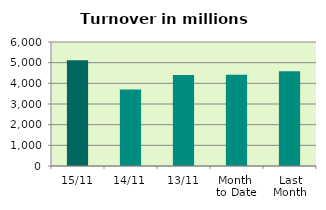
| Category | Series 0 |
|---|---|
| 15/11 | 5120.647 |
| 14/11 | 3697.249 |
| 13/11 | 4401.179 |
| Month 
to Date | 4420.732 |
| Last
Month | 4589.98 |